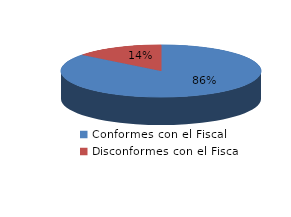
| Category | Series 0 |
|---|---|
| 0 | 298 |
| 1 | 50 |